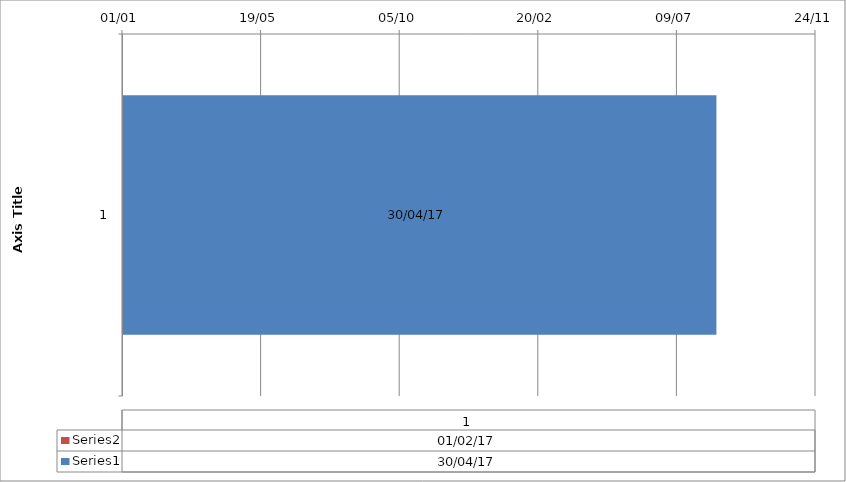
| Category | Series 1 | Series 0 |
|---|---|---|
| 0 | 2017-02-01 | 2017-04-30 |